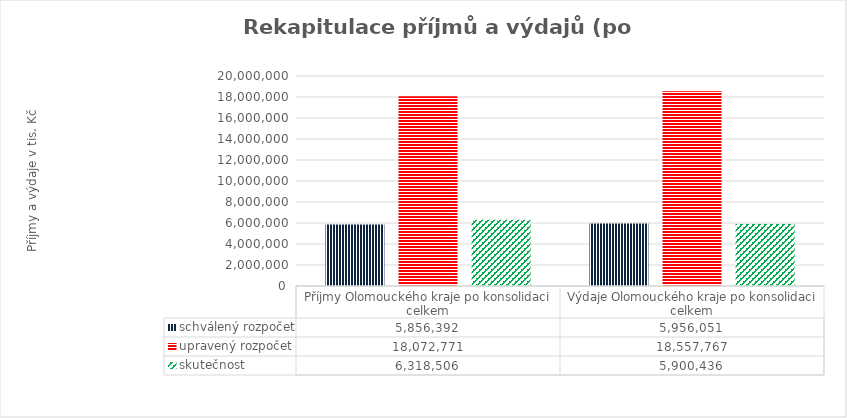
| Category | schválený rozpočet | upravený rozpočet | skutečnost |
|---|---|---|---|
| Příjmy Olomouckého kraje po konsolidaci celkem | 5856392 | 18072771 | 6318506 |
| Výdaje Olomouckého kraje po konsolidaci celkem | 5956051 | 18557767 | 5900436 |